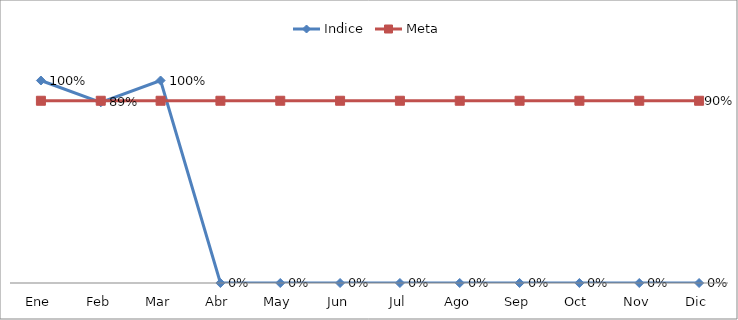
| Category | Indice | Meta |
|---|---|---|
| Ene | 1 | 0.9 |
| Feb | 0.892 | 0.9 |
| Mar | 1 | 0.9 |
| Abr | 0 | 0.9 |
| May | 0 | 0.9 |
| Jun | 0 | 0.9 |
| Jul | 0 | 0.9 |
| Ago | 0 | 0.9 |
| Sep | 0 | 0.9 |
| Oct | 0 | 0.9 |
| Nov | 0 | 0.9 |
| Dic | 0 | 0.9 |